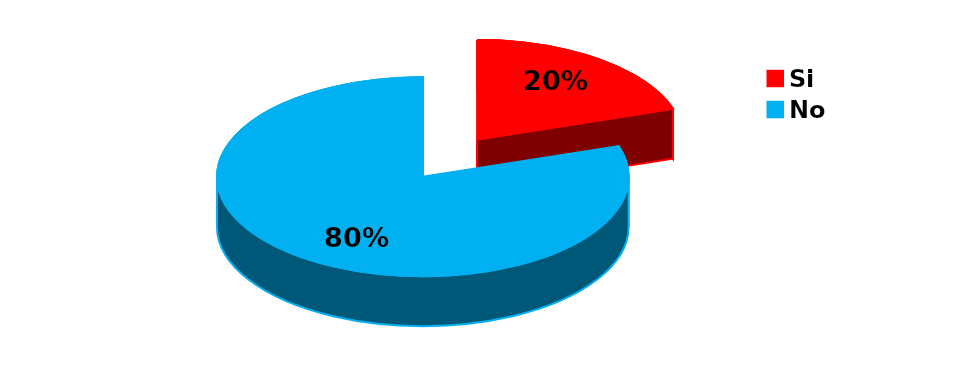
| Category | Series 0 |
|---|---|
| Si | 2 |
| No | 8 |